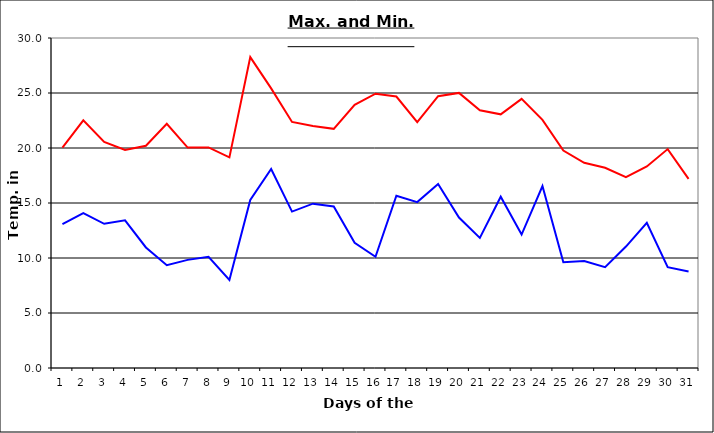
| Category | Series 0 | Series 1 |
|---|---|---|
| 0 | 20.03 | 13.07 |
| 1 | 22.52 | 14.08 |
| 2 | 20.55 | 13.11 |
| 3 | 19.83 | 13.43 |
| 4 | 20.2 | 10.96 |
| 5 | 22.2 | 9.34 |
| 6 | 20.04 | 9.83 |
| 7 | 20.05 | 10.11 |
| 8 | 19.15 | 8 |
| 9 | 28.26 | 15.28 |
| 10 | 25.42 | 18.09 |
| 11 | 22.37 | 14.22 |
| 12 | 22 | 14.94 |
| 13 | 21.74 | 14.68 |
| 14 | 23.93 | 11.38 |
| 15 | 24.94 | 10.11 |
| 16 | 24.68 | 15.66 |
| 17 | 22.36 | 15.08 |
| 18 | 24.71 | 16.73 |
| 19 | 25.01 | 13.68 |
| 20 | 23.43 | 11.83 |
| 21 | 23.06 | 15.57 |
| 22 | 24.47 | 12.13 |
| 23 | 22.56 | 16.54 |
| 24 | 19.77 | 9.62 |
| 25 | 18.66 | 9.72 |
| 26 | 18.2 | 9.16 |
| 27 | 17.35 | 11.04 |
| 28 | 18.32 | 13.2 |
| 29 | 19.9 | 9.16 |
| 30 | 17.19 | 8.77 |